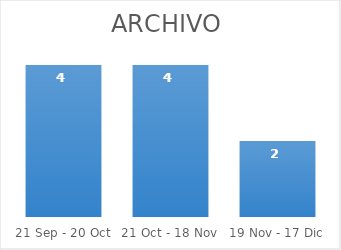
| Category | Series 0 |
|---|---|
| 21 Sep - 20 Oct | 4 |
| 21 Oct - 18 Nov | 4 |
| 19 Nov - 17 Dic | 2 |